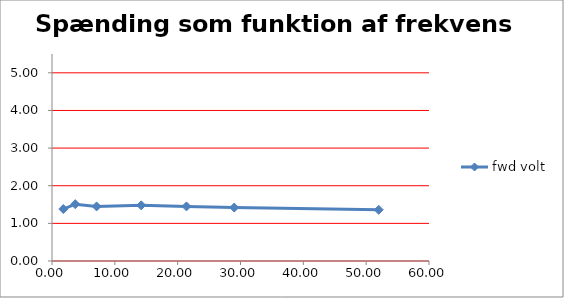
| Category | fwd volt |
|---|---|
| 1.8 | 1.38 |
| 3.7 | 1.51 |
| 7.1 | 1.45 |
| 14.2 | 1.48 |
| 21.4 | 1.45 |
| 29.0 | 1.42 |
| 52.0 | 1.36 |